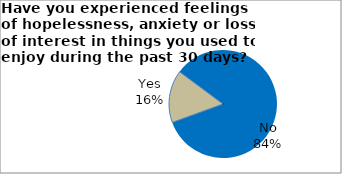
| Category | Series 0 |
|---|---|
| Yes | 15.717 |
| No | 84.283 |